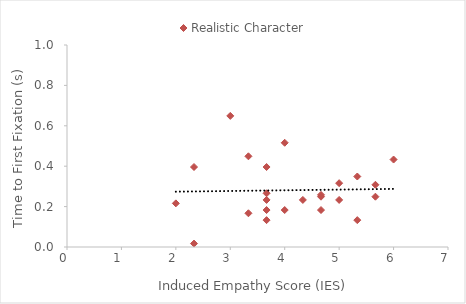
| Category | Realistic Character |
|---|---|
| 5.666666666666667 | 0.308 |
| 3.6666666666666665 | 0.233 |
| 2.3333333333333335 | 0.396 |
| 4.666666666666667 | 0.258 |
| 5.0 | 0.316 |
| 4.0 | 0.516 |
| 3.6666666666666665 | 0.396 |
| 5.0 | 0.233 |
| 2.0 | 0.216 |
| 5.333333333333333 | 0.133 |
| 3.6666666666666665 | 0.133 |
| 6.0 | 0.433 |
| 3.3333333333333335 | 0.167 |
| 5.666666666666667 | 0.249 |
| 3.6666666666666665 | 0.183 |
| 3.6666666666666665 | 0.266 |
| 5.333333333333333 | 0.349 |
| 3.0 | 0.649 |
| 4.666666666666667 | 0.183 |
| 2.3333333333333335 | 0.017 |
| 4.666666666666667 | 0.249 |
| 4.0 | 0.183 |
| 3.3333333333333335 | 0.449 |
| 4.333333333333333 | 0.233 |